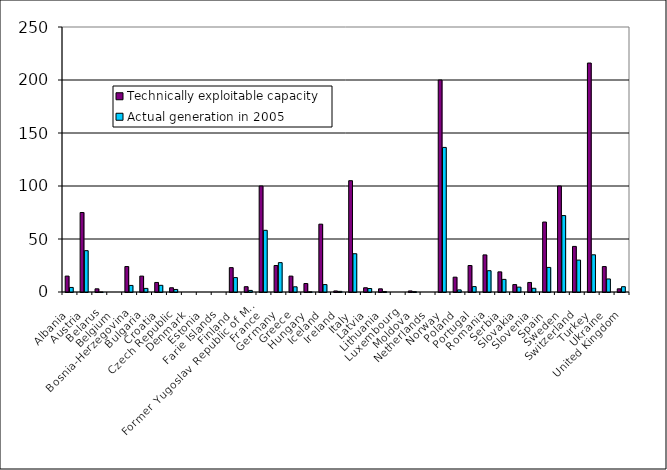
| Category | Technically exploitable capacity | Actual generation in 2005 |
|---|---|---|
| Albania | 15 | 4.3 |
| Austria | 75 | 39 |
| Belarus | 3 | 0.024 |
| Belgium | 0 | 0 |
| Bosnia-Herzegovina | 24 | 6.2 |
| Bulgaria | 15 | 3.4 |
| Croatia | 9 | 6.3 |
| Czech Republic | 4 | 2.4 |
| Denmark | 0 | 0 |
| Estonia | 0 | 0 |
| Farie Islands | 0 | 0 |
| Finland | 23 | 13.6 |
| Former Yugoslav Republic of Macedonia | 5 | 1.5 |
| France | 100 | 58.2 |
| Germany | 25 | 27.7 |
| Greece | 15 | 4.9 |
| Hungary | 8 | 0.2 |
| Iceland | 64 | 7 |
| Ireland | 1 | 0.6 |
| Italy | 105 | 36.1 |
| Latvia | 4 | 3.3 |
| Lithuania | 3 | 0.4 |
| Luxembourg | 0 | 0 |
| Moldova | 1 | 0.3 |
| Netherlands | 0 | 0 |
| Norway | 200 | 136.4 |
| Poland | 14 | 2 |
| Portugal | 25 | 5.1 |
| Romania | 35 | 20.1 |
| Serbia | 19 | 11.9 |
| Slovakia | 7 | 4.6 |
| Slovenia | 9 | 3.5 |
| Spain | 66 | 23.2 |
| Sweden | 100 | 72.1 |
| Switzerland | 43 | 30.1 |
| Turkey | 216 | 35.1 |
| Ukraine | 24 | 12.3 |
| United Kingdom | 3 | 5 |